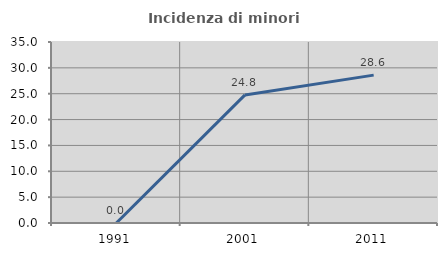
| Category | Incidenza di minori stranieri |
|---|---|
| 1991.0 | 0 |
| 2001.0 | 24.766 |
| 2011.0 | 28.597 |